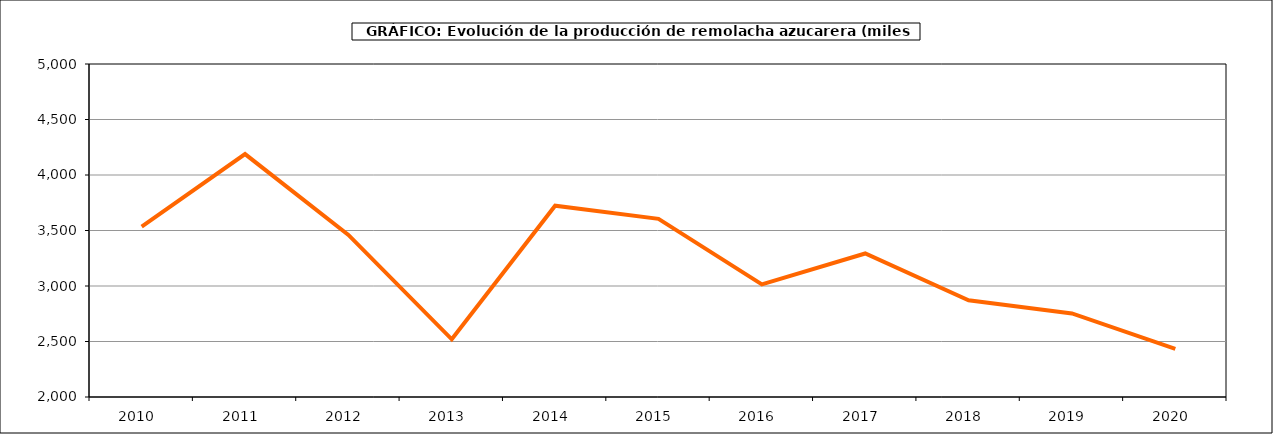
| Category | Producción |
|---|---|
| 2010.0 | 3534.517 |
| 2011.0 | 4188.535 |
| 2012.0 | 3460.23 |
| 2013.0 | 2519.482 |
| 2014.0 | 3723.309 |
| 2015.0 | 3605.112 |
| 2016.0 | 3014.358 |
| 2017.0 | 3292.75 |
| 2018.0 | 2870.907 |
| 2019.0 | 2752.706 |
| 2020.0 | 2432.844 |